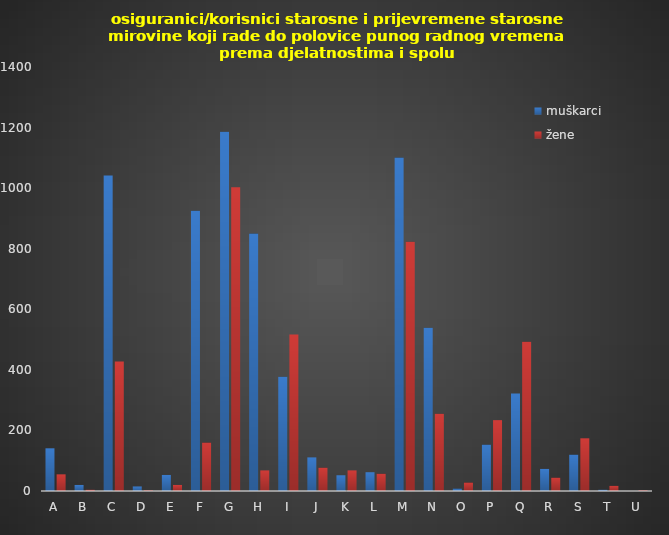
| Category | muškarci | žene |
|---|---|---|
| A | 141 | 55 |
| B | 20 | 4 |
| C | 1042 | 428 |
| D | 15 | 2 |
| E | 53 | 20 |
| F | 925 | 160 |
| G | 1186 | 1003 |
| H | 850 | 68 |
| I | 377 | 517 |
| J | 111 | 77 |
| K | 52 | 68 |
| L | 62 | 57 |
| M | 1101 | 823 |
| N | 539 | 255 |
| O | 8 | 28 |
| P | 153 | 234 |
| Q | 322 | 493 |
| R | 73 | 44 |
| S | 120 | 174 |
| T | 4 | 17 |
| U | 0 | 2 |